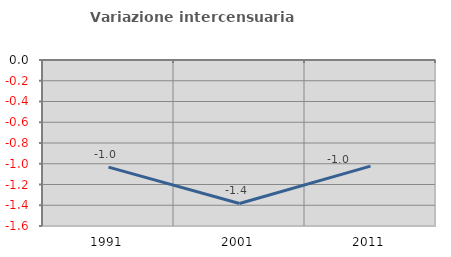
| Category | Variazione intercensuaria annua |
|---|---|
| 1991.0 | -1.033 |
| 2001.0 | -1.383 |
| 2011.0 | -1.023 |